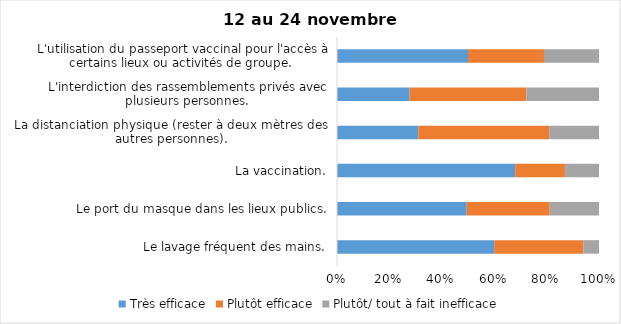
| Category | Très efficace | Plutôt efficace | Plutôt/ tout à fait inefficace |
|---|---|---|---|
| Le lavage fréquent des mains. | 60 | 34 | 6 |
| Le port du masque dans les lieux publics. | 50 | 32 | 19 |
| La vaccination. | 68 | 19 | 13 |
| La distanciation physique (rester à deux mètres des autres personnes). | 31 | 50 | 19 |
| L'interdiction des rassemblements privés avec plusieurs personnes. | 28 | 45 | 28 |
| L'utilisation du passeport vaccinal pour l'accès à certains lieux ou activités de groupe.  | 50 | 29 | 21 |